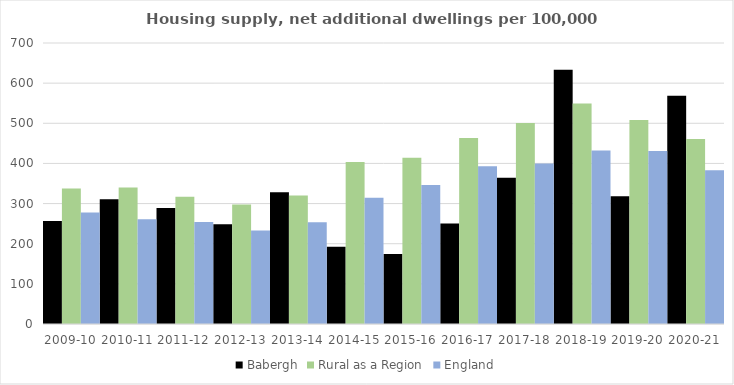
| Category | Babergh | Rural as a Region | England |
|---|---|---|---|
| 2009-10 | 256.888 | 337.852 | 277.548 |
| 2010-11 | 311.046 | 340.105 | 260.994 |
| 2011-12 | 289.153 | 317.04 | 254.007 |
| 2012-13 | 248.615 | 297.763 | 233.153 |
| 2013-14 | 328.057 | 319.835 | 253.602 |
| 2014-15 | 192.366 | 403.796 | 314.256 |
| 2015-16 | 174.638 | 414.091 | 346.154 |
| 2016-17 | 250.416 | 463.209 | 393.256 |
| 2017-18 | 364.562 | 500.68 | 399.646 |
| 2018-19 | 633.472 | 549.491 | 432.099 |
| 2019-20 | 318.354 | 508.493 | 431.187 |
| 2020-21 | 568.286 | 461.114 | 382.827 |